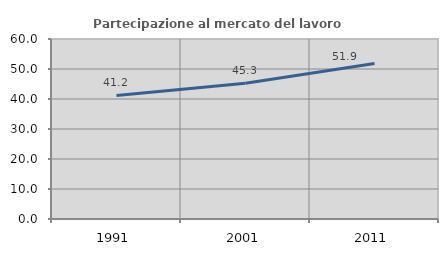
| Category | Partecipazione al mercato del lavoro  femminile |
|---|---|
| 1991.0 | 41.181 |
| 2001.0 | 45.281 |
| 2011.0 | 51.857 |